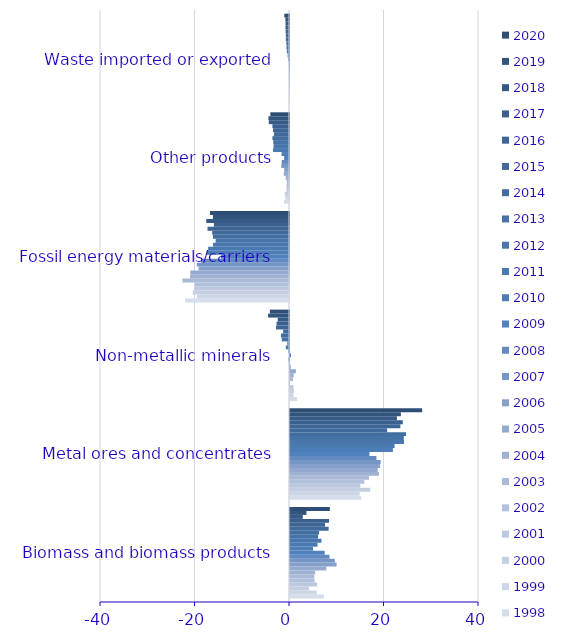
| Category | 1998 | 1999 | 2000 | 2001 | 2002 | 2003 | 2004 | 2005 | 2006 | 2007 | 2008 | 2009 | 2010 | 2011 | 2012 | 2013 | 2014 | 2015 | 2016 | 2017 | 2018 | 2019 | 2020 |
|---|---|---|---|---|---|---|---|---|---|---|---|---|---|---|---|---|---|---|---|---|---|---|---|
| Biomass and biomass products | 7.155 | 5.646 | 4.006 | 5.745 | 5.214 | 5.129 | 5.324 | 7.68 | 9.854 | 9.479 | 8.37 | 7.344 | 4.868 | 5.828 | 6.657 | 5.93 | 6.124 | 8.178 | 7.418 | 8.266 | 2.696 | 3.474 | 8.429 |
| Metal ores and concentrates | 15.11 | 14.74 | 16.983 | 14.88 | 15.735 | 16.716 | 18.835 | 18.572 | 19.062 | 19.19 | 18.291 | 16.819 | 21.769 | 22.139 | 24.122 | 24.076 | 24.563 | 20.564 | 23.355 | 23.862 | 22.633 | 23.466 | 27.969 |
| Non-metallic minerals | 1.521 | 0.726 | 0.835 | 0.719 | -0.034 | 0.636 | 0.795 | 1.249 | 0.15 | 0.005 | -0.148 | 0.223 | -0.152 | -0.679 | -0.36 | -1.529 | -1.692 | -1.239 | -2.738 | -2.63 | -2.375 | -4.426 | -4.05 |
| Fossil energy materials/carriers | -21.988 | -19.506 | -20.354 | -19.978 | -19.893 | -22.552 | -20.945 | -20.876 | -19.131 | -19.5 | -18.604 | -14.398 | -17.446 | -17.122 | -16.073 | -15.52 | -16.08 | -16.262 | -17.248 | -15.893 | -17.516 | -16.108 | -16.719 |
| Other products | -1.083 | -0.784 | -0.882 | -0.553 | -0.531 | -0.472 | -0.702 | -1.108 | -1.006 | -1.629 | -1.537 | -1.024 | -1.573 | -3.384 | -3.263 | -3.334 | -3.507 | -3.187 | -3.379 | -3.511 | -4.279 | -4.357 | -3.956 |
| Waste imported or exported | 0 | 0 | 0 | 0 | -0.002 | -0.002 | -0.002 | -0.017 | -0.008 | -0.013 | -0.027 | -0.156 | -0.29 | -0.46 | -0.534 | -0.56 | -0.667 | -0.671 | -0.712 | -0.756 | -0.736 | -0.773 | -0.991 |